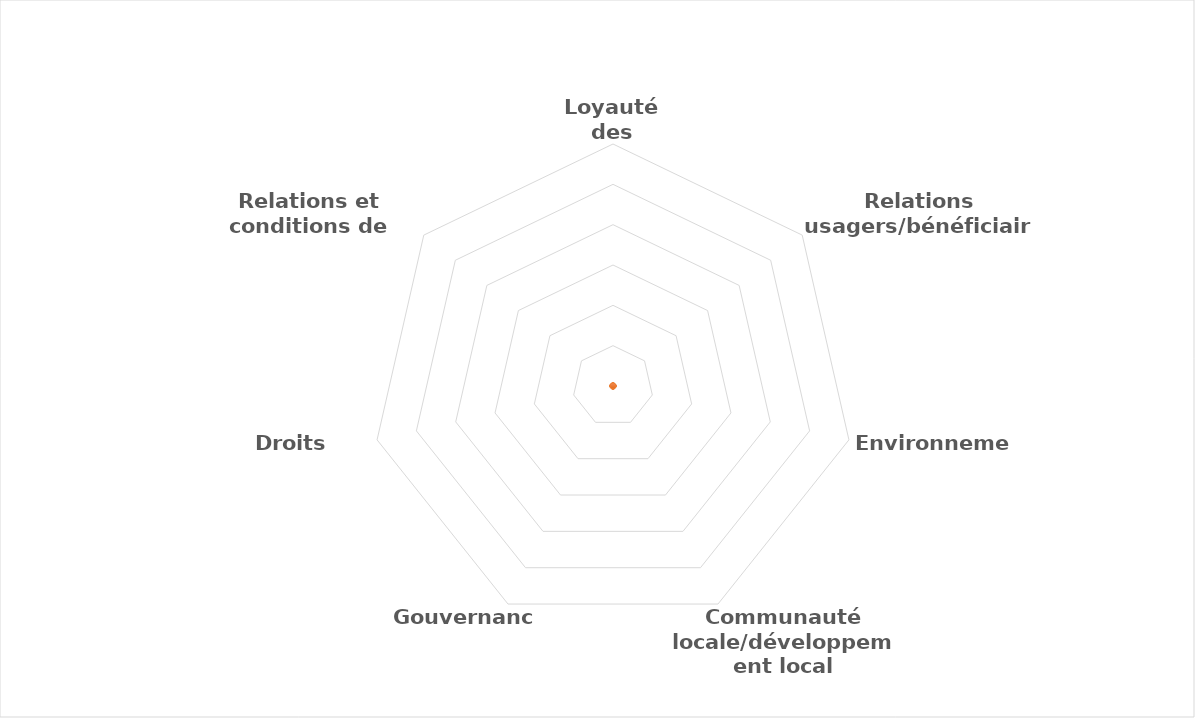
| Category | Series 0 |
|---|---|
| Loyauté des pratiques | 0 |
| Relations usagers/bénéficiaires | 0 |
| Environnement | 0 |
| Communauté locale/développement local | 0 |
| Gouvernance | 0 |
| Droits humains | 0 |
| Relations et conditions de travail | 0 |